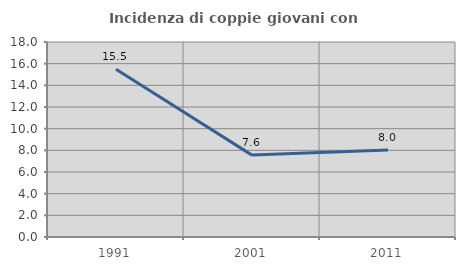
| Category | Incidenza di coppie giovani con figli |
|---|---|
| 1991.0 | 15.488 |
| 2001.0 | 7.558 |
| 2011.0 | 8.041 |